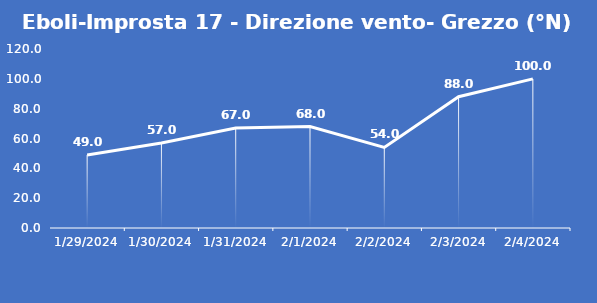
| Category | Eboli-Improsta 17 - Direzione vento- Grezzo (°N) |
|---|---|
| 1/29/24 | 49 |
| 1/30/24 | 57 |
| 1/31/24 | 67 |
| 2/1/24 | 68 |
| 2/2/24 | 54 |
| 2/3/24 | 88 |
| 2/4/24 | 100 |